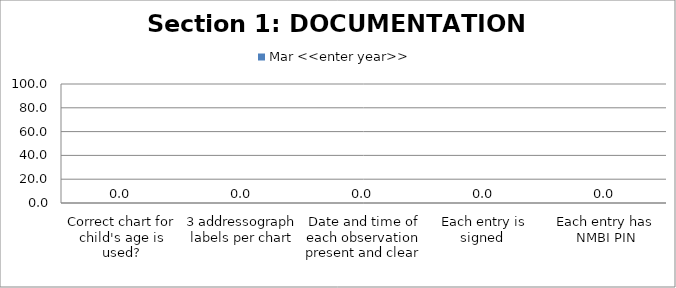
| Category | Mar <<enter year>> |
|---|---|
| Correct chart for child's age is used? | 0 |
| 3 addressograph labels per chart | 0 |
| Date and time of each observation present and clear  | 0 |
| Each entry is signed  | 0 |
| Each entry has NMBI PIN | 0 |